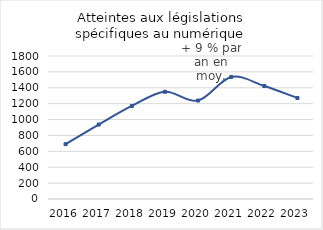
| Category | Atteintes législations spécifiques au numérique |
|---|---|
| 2016.0 | 690 |
| 2017.0 | 937 |
| 2018.0 | 1171 |
| 2019.0 | 1350 |
| 2020.0 | 1239 |
| 2021.0 | 1536 |
| 2022.0 | 1422 |
| 2023.0 | 1271 |